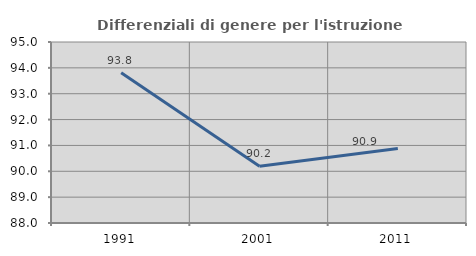
| Category | Differenziali di genere per l'istruzione superiore |
|---|---|
| 1991.0 | 93.812 |
| 2001.0 | 90.194 |
| 2011.0 | 90.884 |